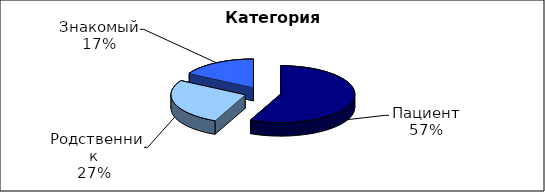
| Category | Series 0 |
|---|---|
| Пациент | 170 |
|  Родственник | 80 |
| Знакомый | 50 |